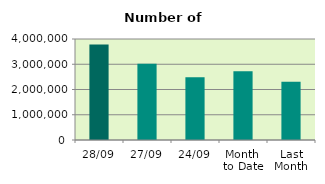
| Category | Series 0 |
|---|---|
| 28/09 | 3779502 |
| 27/09 | 3019252 |
| 24/09 | 2484554 |
| Month 
to Date | 2719416.2 |
| Last
Month | 2303894.727 |